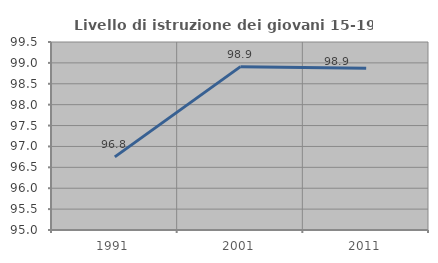
| Category | Livello di istruzione dei giovani 15-19 anni |
|---|---|
| 1991.0 | 96.751 |
| 2001.0 | 98.91 |
| 2011.0 | 98.874 |